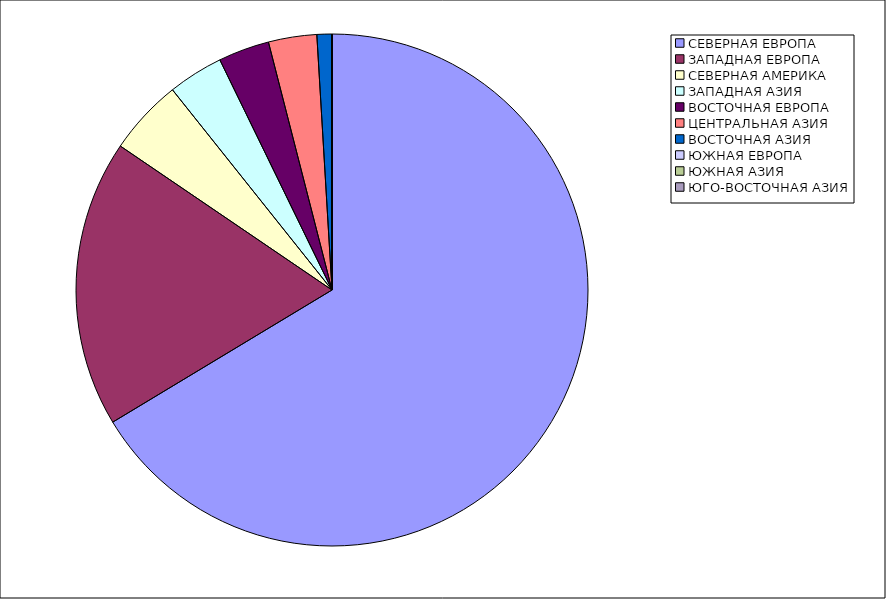
| Category | Оборот |
|---|---|
| СЕВЕРНАЯ ЕВРОПА | 66.367 |
| ЗАПАДНАЯ ЕВРОПА | 18.138 |
| СЕВЕРНАЯ АМЕРИКА | 4.785 |
| ЗАПАДНАЯ АЗИЯ | 3.492 |
| ВОСТОЧНАЯ ЕВРОПА | 3.223 |
| ЦЕНТРАЛЬНАЯ АЗИЯ | 3.05 |
| ВОСТОЧНАЯ АЗИЯ | 0.941 |
| ЮЖНАЯ ЕВРОПА | 0.004 |
| ЮЖНАЯ АЗИЯ | 0 |
| ЮГО-ВОСТОЧНАЯ АЗИЯ | 0 |